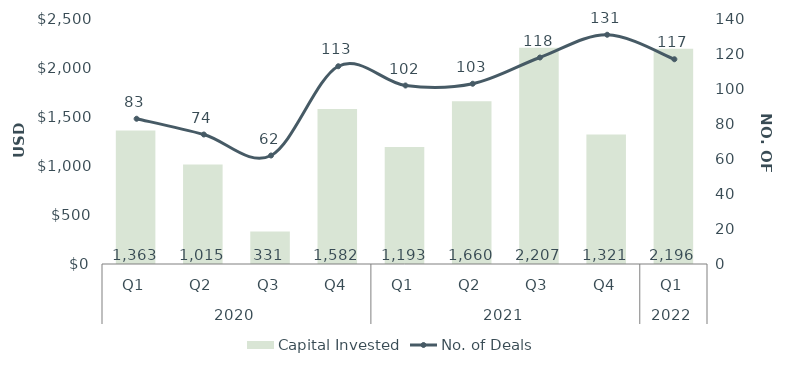
| Category | Capital Invested |
|---|---|
| 0 | 1362.752 |
| 1 | 1014.81 |
| 2 | 331.291 |
| 3 | 1582.031 |
| 4 | 1192.639 |
| 5 | 1659.582 |
| 6 | 2206.828 |
| 7 | 1320.683 |
| 8 | 2195.554 |